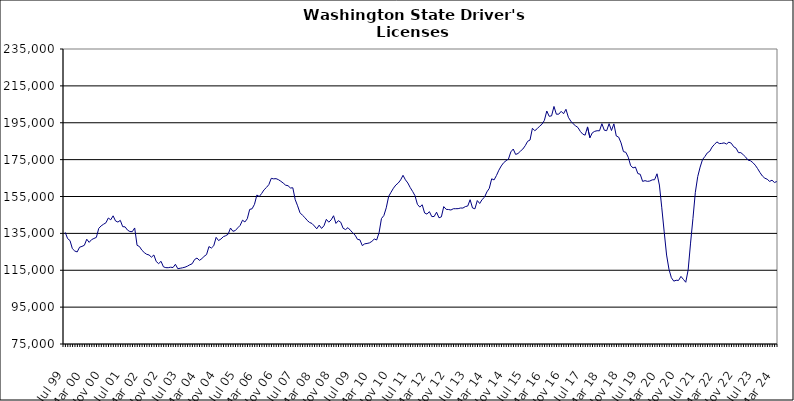
| Category | Series 0 |
|---|---|
| Jul 99 | 135560 |
| Aug 99 | 132182 |
| Sep 99 | 131104 |
| Oct 99 | 126694 |
| Nov 99 | 125425 |
| Dec 99 | 124927 |
| Jan 00 | 127499 |
| Feb 00 | 127927 |
| Mar 00 | 128547 |
| Apr 00 | 131834 |
| May 00 | 130120 |
| Jun 00 | 131595 |
| Jul 00 | 132236 |
| Aug 00 | 132819 |
| Sep 00 | 137711 |
| Oct 00 | 139063 |
| Nov 00 | 139952 |
| Dec 00 | 140732 |
| Jan 01 | 143338 |
| Feb 01 | 142359 |
| Mar 01 | 144523 |
| Apr 01 | 141758 |
| May 01 | 141135 |
| Jun 01 | 142064 |
| Jul 01 | 138646 |
| Aug 01 | 138530 |
| Sep 01 | 136784 |
| Oct 01 | 135996 |
| Nov 01 | 135917 |
| Dec 01 | 137940 |
| Jan 02 | 128531 |
| Feb 02 | 127848 |
| Mar 02 | 125876 |
| Apr 02 | 124595 |
| May 02 | 123660 |
| Jun 02 | 123282 |
| Jul 02 | 122089 |
| Aug 02 | 123279 |
| Sep 02 | 119727 |
| Oct 02 | 118588 |
| Nov 02 | 119854 |
| Dec 02 | 116851 |
| Jan 03 | 116407 |
| Feb 03 | 116382 |
| Mar 03 | 116648 |
| Apr 03 | 116471 |
| May 03 | 118231 |
| Jun 03 | 115831 |
| Jul 03 | 116082 |
| Aug 03 | 116341 |
| Sep 03 | 116653 |
| Oct 03 | 117212 |
| Nov 03 | 117962 |
| Dec 03 | 118542 |
| Jan 04 | 120817 |
| Feb 04 | 121617 |
| Mar 04 | 120369 |
| Apr 04 | 121200 |
| May 04 | 122609 |
| Jun 04 | 123484 |
| Jul 04 | 127844 |
| Aug 04 | 127025 |
| Sep 04 | 128273 |
| Oct 04 | 132853 |
| Nov 04 | 131106 |
| Dec 04 | 131935 |
| Jan 05 | 133205 |
| Feb 05 | 133736 |
| Mar 05 | 134528 |
| Apr 05 | 137889 |
| May 05 | 136130 |
| Jun 05 | 136523 |
| Jul 05 | 137997 |
| Aug 05 | 139294 |
| Sep 05 | 142140 |
| Oct 05 | 141192 |
| Nov 05 | 142937 |
| Dec 05 | 148013 |
| Jan 06 | 148341 |
| Feb 06 | 150744 |
| Mar 06 | 155794 |
| Apr 06 | 154984 |
| May 06 | 156651 |
| Jun 06 | 158638 |
| Jul 06 | 159911 |
| Aug 06 | 161445 |
| Sep 06 | 164852 |
| Oct 06 | 164570 |
| Nov 06 | 164679 |
| Dec 06 | 164127 |
| Jan 07 | 163271 |
| Feb 07 | 162273 |
| Mar 07 | 161140 |
| Apr 07 | 160860 |
| May 07 | 159633 |
| Jun 07 | 159724 |
| Jul 07 | 153303 |
| Aug 07 | 149939 |
| Sep 07 | 146172 |
| Oct 07 | 144876 |
| Nov 07 | 143613 |
| Dec 07 | 142022 |
| Jan 08 | 140909 |
| Feb 08 | 140368 |
| Mar 08 | 138998 |
| Apr 08 | 137471 |
| May 08 | 139453 |
| Jun 08 | 137680 |
| Jul 08 | 139120 |
| Aug 08 | 142612 |
| Sep-08 | 141071 |
| Oct 08 | 142313 |
| Nov 08 | 144556 |
| Dec 08 | 140394 |
| Jan 09 | 141903 |
| Feb 09 | 141036 |
| Mar 09 | 137751 |
| Apr 09 | 137060 |
| May 09 | 138101 |
| Jun 09 | 136739 |
| Jul 09 | 135317 |
| Aug 09 | 134020 |
| Sep 09 | 131756 |
| Oct 09 | 131488 |
| Nov 09 | 128370 |
| Dec 09 | 129323 |
| Jan 10 | 129531 |
| Feb 10 | 129848 |
| Mar 10 | 130654 |
| Apr 10 | 131929 |
| May 10 | 131429 |
| Jun 10 | 135357 |
| Jul 10 | 143032 |
| Aug 10 | 144686 |
| Sep 10 | 148856 |
| Oct 10 | 155042 |
| Nov 10 | 157328 |
| Dec 10 | 159501 |
| Jan 11 | 161221 |
| Feb 11 | 162312 |
| Mar 11 | 163996 |
| Apr 11 | 166495 |
| May 11 | 164040 |
| Jun 11 | 162324 |
| Jul 11 | 159862 |
| Aug 11 | 157738 |
| Sep 11 | 155430 |
| Oct 11 | 150762 |
| Nov 11 | 149255 |
| Dec 11 | 150533 |
| Jan 12 | 146068 |
| Feb 12 | 145446 |
| Mar 12 | 146788 |
| Apr 12 | 144110 |
| May 12 | 144162 |
| Jun 12 | 146482 |
| Jul 12 | 143445 |
| Aug 12 | 143950 |
| Sep 12 | 149520 |
| Oct 12 | 148033 |
| Nov 12 | 147926 |
| Dec 12 | 147674 |
| Jan 13 | 148360 |
| Feb-13 | 148388 |
| Mar-13 | 148414 |
| Apr 13 | 148749 |
| May 13 | 148735 |
| Jun-13 | 149521 |
| Jul 13 | 149837 |
| Aug 13 | 153252 |
| Sep 13 | 148803 |
| Oct 13 | 148315 |
| Nov 13 | 152804 |
| Dec 13 | 151209 |
| Jan 14 | 153357 |
| Feb-14 | 154608 |
| Mar 14 | 157479 |
| Apr 14 | 159441 |
| May 14 | 164591 |
| Jun 14 | 163995 |
| Jul-14 | 166411 |
| Aug-14 | 169272 |
| Sep 14 | 171565 |
| Oct 14 | 173335 |
| Nov 14 | 174406 |
| Dec 14 | 175302 |
| Jan 15 | 179204 |
| Feb 15 | 180737 |
| Mar 15 | 177810 |
| Apr-15 | 178331 |
| May 15 | 179601 |
| Jun-15 | 180729 |
| Jul 15 | 182540 |
| Aug 15 | 184924 |
| Sep 15 | 185620 |
| Oct 15 | 192002 |
| Nov 15 | 190681 |
| Dec 15 | 191795 |
| Jan 16 | 193132 |
| Feb 16 | 194206 |
| Mar 16 | 196319 |
| Apr 16 | 201373 |
| May 16 | 198500 |
| Jun 16 | 198743 |
| Jul 16 | 203841 |
| Aug 16 | 199630 |
| Sep 16 | 199655 |
| Oct 16 | 201181 |
| Nov 16 | 199888 |
| Dec 16 | 202304 |
| Jan 17 | 197977 |
| Feb 17 | 195889 |
| Mar 17 | 194438 |
| Apr 17 | 193335 |
| May 17 | 192430 |
| Jun 17 | 190298 |
| Jul 17 | 188832 |
| Aug 17 | 188264 |
| Sep 17 | 192738 |
| Oct 17 | 186856 |
| Nov 17 | 189537 |
| Dec 17 | 190341 |
| Jan 18 | 190670 |
| Feb 18 | 190645 |
| Mar 18 | 194476 |
| Apr 18 | 190971 |
| May 18 | 190707 |
| Jun 18 | 194516 |
| Jul 18 | 190783 |
| Aug 18 | 194390 |
| Sep 18 | 187831 |
| Oct 18 | 187188 |
| Nov 18 | 184054 |
| Dec 18 | 179347 |
| Jan 19 | 178958 |
| Feb 19 | 176289 |
| Mar 19 | 171747 |
| Apr 19 | 170532 |
| May 19 | 170967 |
| Jun 19 | 167444 |
| Jul 19 | 167059 |
| Aug 19 | 163194 |
| Sep 19 | 163599 |
| Oct 19 | 163212 |
| Nov 19 | 163388 |
| Dec 19 | 164024 |
| Jan 20 | 164114 |
| Feb 20 | 167320 |
| Mar 20 | 161221 |
| Apr 20 | 148866 |
| May 20 | 135821 |
| Jun 20 | 123252 |
| Jul 20 | 115526 |
| Aug 20 | 110940 |
| Sep 20 | 109099 |
| Oct 20 | 109566 |
| Nov 20 | 109488 |
| Dec 20 | 111658 |
| Jan 21 | 110070 |
| Feb 21 | 108491 |
| Mar 21 | 115176 |
| Apr 21 | 129726 |
| May 21 | 143052 |
| Jun 21 | 157253 |
| Jul 21 | 165832 |
| Aug 21 | 170937 |
| Sep 21 | 175042 |
| Oct 21 | 176696 |
| Nov 21 | 178677 |
| Dec 21 | 179501 |
| Jan 22 | 181825 |
| Feb 22 | 183258 |
| Mar 22 | 184618 |
| Apr 22 | 183710 |
| May 22 | 183784 |
| Jun 22 | 184101 |
| Jul 22 | 183443 |
| Aug 22 | 184475 |
| Sep 22 | 183902 |
| Oct 22 | 181994 |
| Nov 22 | 181207 |
| Dec 22 | 178793 |
| Jan 23 | 178782 |
| Feb 23 | 177647 |
| Mar 23 | 176386 |
| Apr 23 | 174729 |
| May 23 | 174390 |
| Jun 23 | 173391 |
| Jul 23 | 171988 |
| Aug 23 | 170100 |
| Sep 23 | 167953 |
| Oct 23 | 166088 |
| Nov 23 | 164934 |
| Dec 23 | 164371 |
| Jan 24 | 163182 |
| Feb 24 | 163845 |
| Mar 24 | 162603 |
| Apr 24 | 163109 |